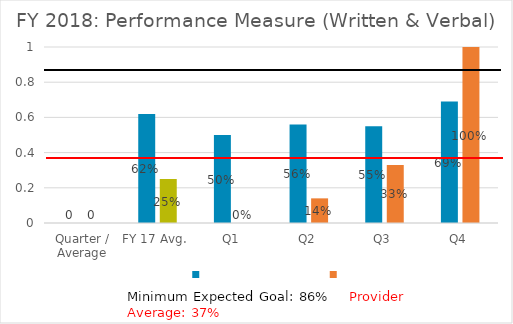
| Category | Series 0 | Series 1 |
|---|---|---|
| Quarter / Average | 0 | 0 |
| FY 17 Avg.  | 0.62 | 0.25 |
| Q1 | 0.5 | 0 |
| Q2 | 0.56 | 0.14 |
| Q3 | 0.55 | 0.33 |
| Q4 | 0.69 | 1 |